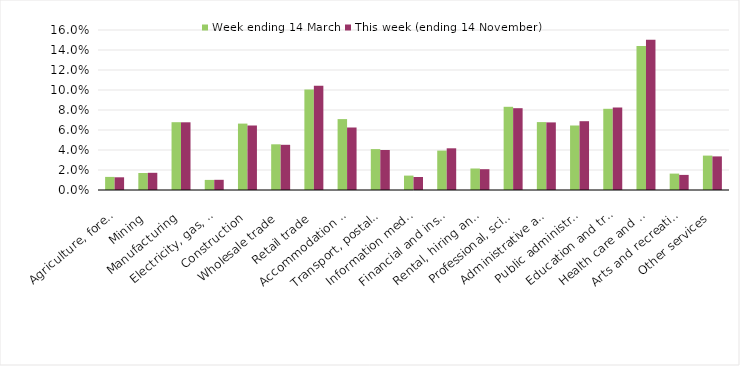
| Category | Week ending 14 March | This week (ending 14 November) |
|---|---|---|
| Agriculture, forestry and fishing | 0.013 | 0.013 |
| Mining | 0.017 | 0.017 |
| Manufacturing | 0.068 | 0.068 |
| Electricity, gas, water and waste services | 0.01 | 0.01 |
| Construction | 0.066 | 0.064 |
| Wholesale trade | 0.046 | 0.045 |
| Retail trade | 0.101 | 0.104 |
| Accommodation and food services | 0.071 | 0.062 |
| Transport, postal and warehousing | 0.041 | 0.04 |
| Information media and telecommunications | 0.014 | 0.013 |
| Financial and insurance services | 0.039 | 0.042 |
| Rental, hiring and real estate services | 0.022 | 0.021 |
| Professional, scientific and technical services | 0.083 | 0.082 |
| Administrative and support services | 0.068 | 0.068 |
| Public administration and safety | 0.064 | 0.069 |
| Education and training | 0.081 | 0.082 |
| Health care and social assistance | 0.144 | 0.15 |
| Arts and recreation services | 0.016 | 0.015 |
| Other services | 0.034 | 0.034 |